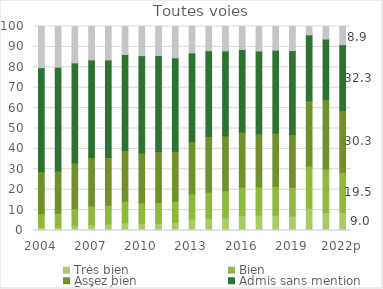
| Category | Très bien | Bien | Assez bien | Admis sans mention | Refusé |
|---|---|---|---|---|---|
| 2004 | 1.557 | 6.731 | 20.575 | 50.975 | 20.161 |
| 2005 | 1.686 | 6.791 | 20.674 | 50.883 | 19.966 |
| 2006 | 2.401 | 8.26 | 22.423 | 49.086 | 17.83 |
| 2007 | 2.941 | 9.132 | 23.669 | 47.871 | 16.388 |
| 2008 | 3.176 | 9.245 | 23.361 | 47.815 | 16.403 |
| 2009 | 3.771 | 10.604 | 24.871 | 47.03 | 13.725 |
| 2010 | 3.508 | 9.979 | 24.502 | 47.732 | 14.279 |
| 2011 | 3.595 | 10.128 | 24.923 | 47.147 | 14.207 |
| 2012 | 4.028 | 10.363 | 24.42 | 45.809 | 15.38 |
| 2013 | 5.705 | 12.242 | 25.754 | 43.323 | 12.976 |
| 2014 | 5.851 | 13.025 | 27.271 | 41.997 | 11.856 |
| 2015 | 6.193 | 13.374 | 26.808 | 41.648 | 11.976 |
| 2016 | 7.268 | 14.031 | 26.978 | 40.439 | 11.284 |
| 2017 | 7.572 | 13.881 | 25.948 | 40.609 | 11.989 |
| 2018 | 7.509 | 14.139 | 26.09 | 40.637 | 11.624 |
| 2019 | 7.126 | 14.099 | 25.835 | 41.135 | 11.804 |
| 2020 | 10.922 | 20.724 | 32.011 | 32.271 | 4.071 |
| 2021 | 8.761 | 21.326 | 34.143 | 29.623 | 6.148 |
| 2022p | 8.98 | 19.478 | 30.341 | 32.272 | 8.928 |